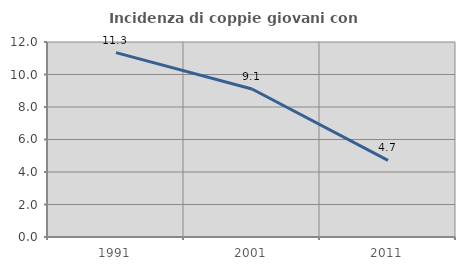
| Category | Incidenza di coppie giovani con figli |
|---|---|
| 1991.0 | 11.345 |
| 2001.0 | 9.105 |
| 2011.0 | 4.715 |